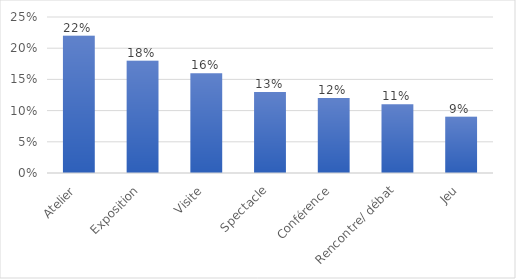
| Category | Series 0 |
|---|---|
| Atelier | 0.22 |
| Exposition | 0.18 |
| Visite | 0.16 |
| Spectacle | 0.13 |
| Conférence | 0.12 |
| Rencontre/ débat | 0.11 |
| Jeu | 0.09 |